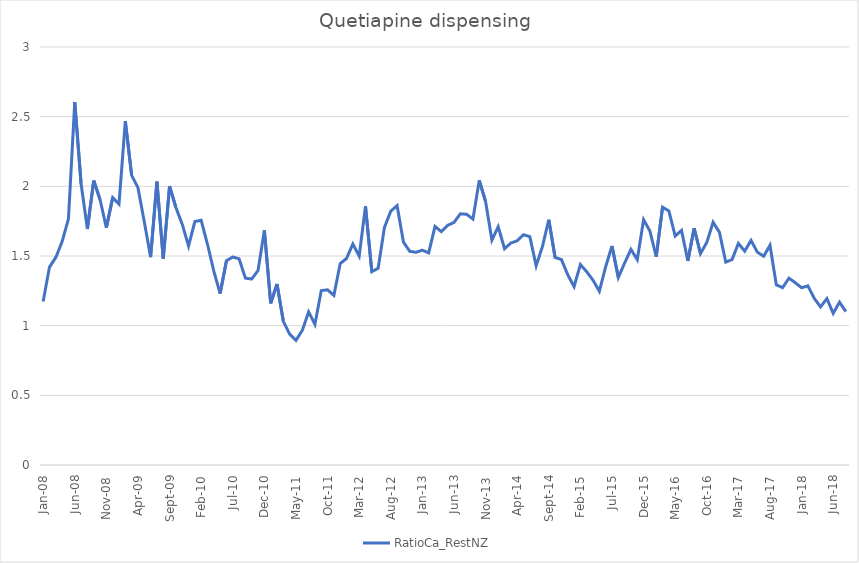
| Category | RatioCa_RestNZ |
|---|---|
| 2008-01-01 | 1.173 |
| 2008-02-01 | 1.421 |
| 2008-03-01 | 1.49 |
| 2008-04-01 | 1.603 |
| 2008-05-01 | 1.766 |
| 2008-06-01 | 2.605 |
| 2008-07-01 | 2.019 |
| 2008-08-01 | 1.694 |
| 2008-09-01 | 2.041 |
| 2008-10-01 | 1.905 |
| 2008-11-01 | 1.702 |
| 2008-12-01 | 1.919 |
| 2009-01-01 | 1.872 |
| 2009-02-01 | 2.468 |
| 2009-03-01 | 2.079 |
| 2009-04-01 | 1.99 |
| 2009-05-01 | 1.746 |
| 2009-06-01 | 1.492 |
| 2009-07-01 | 2.033 |
| 2009-08-01 | 1.482 |
| 2009-09-01 | 2.002 |
| 2009-10-01 | 1.848 |
| 2009-11-01 | 1.728 |
| 2009-12-01 | 1.572 |
| 2010-01-01 | 1.747 |
| 2010-02-01 | 1.756 |
| 2010-03-01 | 1.584 |
| 2010-04-01 | 1.392 |
| 2010-05-01 | 1.23 |
| 2010-06-01 | 1.466 |
| 2010-07-01 | 1.493 |
| 2010-08-01 | 1.48 |
| 2010-09-01 | 1.341 |
| 2010-10-01 | 1.335 |
| 2010-11-01 | 1.397 |
| 2010-12-01 | 1.684 |
| 2011-01-01 | 1.16 |
| 2011-02-01 | 1.299 |
| 2011-03-01 | 1.031 |
| 2011-04-01 | 0.939 |
| 2011-05-01 | 0.895 |
| 2011-06-01 | 0.966 |
| 2011-07-01 | 1.099 |
| 2011-08-01 | 1.009 |
| 2011-09-01 | 1.252 |
| 2011-10-01 | 1.257 |
| 2011-11-01 | 1.217 |
| 2011-12-01 | 1.446 |
| 2012-01-01 | 1.482 |
| 2012-02-01 | 1.586 |
| 2012-03-01 | 1.499 |
| 2012-04-01 | 1.857 |
| 2012-05-01 | 1.387 |
| 2012-06-01 | 1.412 |
| 2012-07-01 | 1.706 |
| 2012-08-01 | 1.822 |
| 2012-09-01 | 1.862 |
| 2012-10-01 | 1.6 |
| 2012-11-01 | 1.534 |
| 2012-12-01 | 1.527 |
| 2013-01-01 | 1.542 |
| 2013-02-01 | 1.522 |
| 2013-03-01 | 1.712 |
| 2013-04-01 | 1.675 |
| 2013-05-01 | 1.72 |
| 2013-06-01 | 1.741 |
| 2013-07-01 | 1.803 |
| 2013-08-01 | 1.8 |
| 2013-09-01 | 1.765 |
| 2013-10-01 | 2.043 |
| 2013-11-01 | 1.891 |
| 2013-12-01 | 1.614 |
| 2014-01-01 | 1.71 |
| 2014-02-01 | 1.552 |
| 2014-03-01 | 1.593 |
| 2014-04-01 | 1.609 |
| 2014-05-01 | 1.653 |
| 2014-06-01 | 1.639 |
| 2014-07-01 | 1.43 |
| 2014-08-01 | 1.569 |
| 2014-09-01 | 1.76 |
| 2014-10-01 | 1.489 |
| 2014-11-01 | 1.475 |
| 2014-12-01 | 1.366 |
| 2015-01-01 | 1.28 |
| 2015-02-01 | 1.439 |
| 2015-03-01 | 1.387 |
| 2015-04-01 | 1.326 |
| 2015-05-01 | 1.247 |
| 2015-06-01 | 1.423 |
| 2015-07-01 | 1.572 |
| 2015-08-01 | 1.345 |
| 2015-09-01 | 1.45 |
| 2015-10-01 | 1.548 |
| 2015-11-01 | 1.474 |
| 2015-12-01 | 1.761 |
| 2016-01-01 | 1.679 |
| 2016-02-01 | 1.495 |
| 2016-03-01 | 1.851 |
| 2016-04-01 | 1.823 |
| 2016-05-01 | 1.643 |
| 2016-06-01 | 1.684 |
| 2016-07-01 | 1.465 |
| 2016-08-01 | 1.699 |
| 2016-09-01 | 1.517 |
| 2016-10-01 | 1.598 |
| 2016-11-01 | 1.742 |
| 2016-12-01 | 1.67 |
| 2017-01-01 | 1.456 |
| 2017-02-01 | 1.475 |
| 2017-03-01 | 1.591 |
| 2017-04-01 | 1.535 |
| 2017-05-01 | 1.612 |
| 2017-06-01 | 1.528 |
| 2017-07-01 | 1.498 |
| 2017-08-01 | 1.577 |
| 2017-09-01 | 1.293 |
| 2017-10-01 | 1.273 |
| 2017-11-01 | 1.341 |
| 2017-12-01 | 1.309 |
| 2018-01-01 | 1.272 |
| 2018-02-01 | 1.285 |
| 2018-03-01 | 1.196 |
| 2018-04-01 | 1.135 |
| 2018-05-01 | 1.194 |
| 2018-06-01 | 1.088 |
| 2018-07-01 | 1.169 |
| 2018-08-01 | 1.101 |